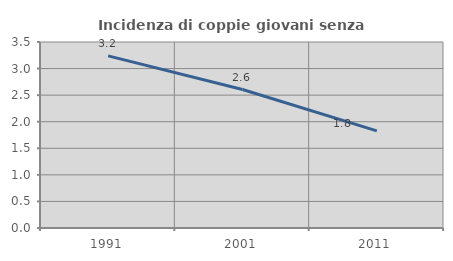
| Category | Incidenza di coppie giovani senza figli |
|---|---|
| 1991.0 | 3.24 |
| 2001.0 | 2.606 |
| 2011.0 | 1.829 |